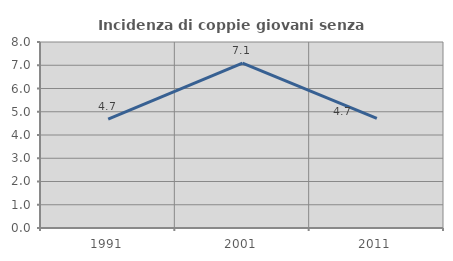
| Category | Incidenza di coppie giovani senza figli |
|---|---|
| 1991.0 | 4.688 |
| 2001.0 | 7.096 |
| 2011.0 | 4.717 |